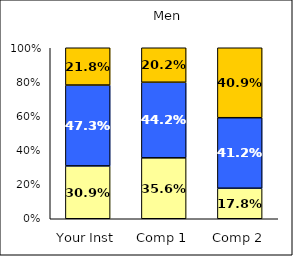
| Category | Low Institutional Priority: Increase Prestige | Average Institutional Priority: Increase Prestige | High Institutional Priority: Increase Prestige |
|---|---|---|---|
| Your Inst | 0.309 | 0.473 | 0.218 |
| Comp 1 | 0.356 | 0.442 | 0.202 |
| Comp 2 | 0.178 | 0.412 | 0.409 |